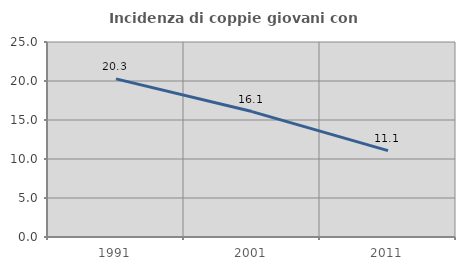
| Category | Incidenza di coppie giovani con figli |
|---|---|
| 1991.0 | 20.27 |
| 2001.0 | 16.08 |
| 2011.0 | 11.069 |